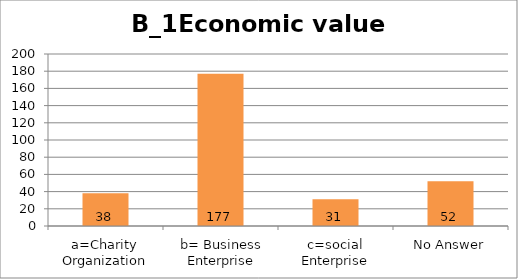
| Category | B_1Economic value creation |
|---|---|
| a=Charity Organization | 38 |
| b= Business Enterprise | 177 |
| c=social Enterprise | 31 |
| No Answer | 52 |